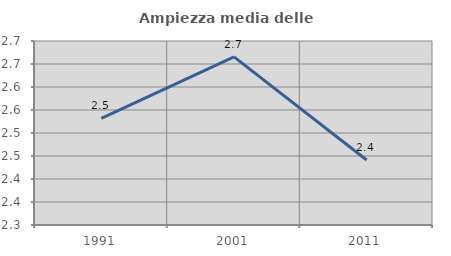
| Category | Ampiezza media delle famiglie |
|---|---|
| 1991.0 | 2.532 |
| 2001.0 | 2.666 |
| 2011.0 | 2.441 |